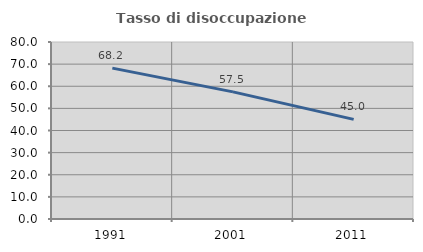
| Category | Tasso di disoccupazione giovanile  |
|---|---|
| 1991.0 | 68.2 |
| 2001.0 | 57.47 |
| 2011.0 | 45.042 |